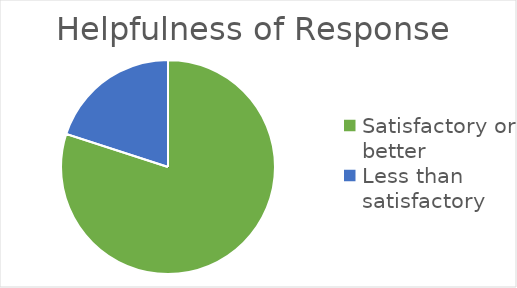
| Category | Series 0 |
|---|---|
| Satisfactory or better | 0.8 |
| Less than satisfactory | 0.2 |